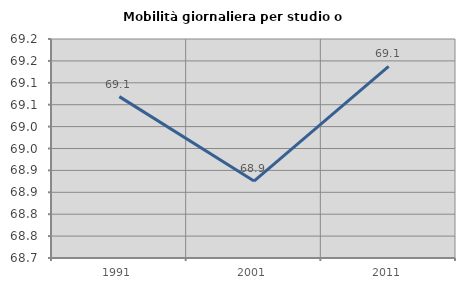
| Category | Mobilità giornaliera per studio o lavoro |
|---|---|
| 1991.0 | 69.068 |
| 2001.0 | 68.876 |
| 2011.0 | 69.138 |